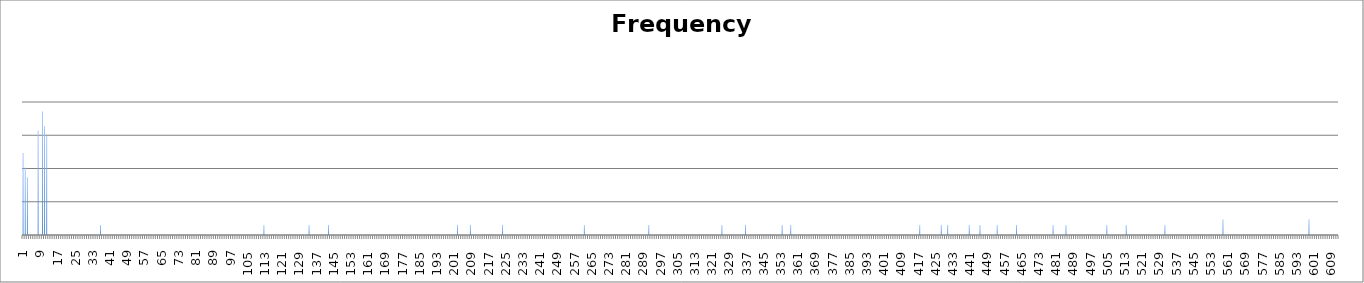
| Category | Series 0 |
|---|---|
| 0 | 282 |
| 1 | 105 |
| 2 | 55 |
| 3 | 0 |
| 4 | 0 |
| 5 | 0 |
| 6 | 0 |
| 7 | 1374 |
| 8 | 0 |
| 9 | 5117 |
| 10 | 1851 |
| 11 | 956 |
| 12 | 0 |
| 13 | 0 |
| 14 | 0 |
| 15 | 0 |
| 16 | 0 |
| 17 | 0 |
| 18 | 0 |
| 19 | 1 |
| 20 | 0 |
| 21 | 0 |
| 22 | 0 |
| 23 | 0 |
| 24 | 0 |
| 25 | 0 |
| 26 | 1 |
| 27 | 1 |
| 28 | 0 |
| 29 | 0 |
| 30 | 0 |
| 31 | 0 |
| 32 | 1 |
| 33 | 0 |
| 34 | 0 |
| 35 | 0 |
| 36 | 2 |
| 37 | 0 |
| 38 | 1 |
| 39 | 0 |
| 40 | 1 |
| 41 | 1 |
| 42 | 0 |
| 43 | 0 |
| 44 | 1 |
| 45 | 1 |
| 46 | 0 |
| 47 | 0 |
| 48 | 0 |
| 49 | 0 |
| 50 | 1 |
| 51 | 0 |
| 52 | 1 |
| 53 | 0 |
| 54 | 0 |
| 55 | 1 |
| 56 | 0 |
| 57 | 0 |
| 58 | 0 |
| 59 | 1 |
| 60 | 0 |
| 61 | 0 |
| 62 | 0 |
| 63 | 1 |
| 64 | 0 |
| 65 | 0 |
| 66 | 0 |
| 67 | 0 |
| 68 | 0 |
| 69 | 0 |
| 70 | 0 |
| 71 | 0 |
| 72 | 0 |
| 73 | 0 |
| 74 | 1 |
| 75 | 0 |
| 76 | 0 |
| 77 | 0 |
| 78 | 0 |
| 79 | 0 |
| 80 | 1 |
| 81 | 0 |
| 82 | 0 |
| 83 | 0 |
| 84 | 1 |
| 85 | 0 |
| 86 | 0 |
| 87 | 0 |
| 88 | 0 |
| 89 | 1 |
| 90 | 0 |
| 91 | 1 |
| 92 | 0 |
| 93 | 1 |
| 94 | 0 |
| 95 | 1 |
| 96 | 0 |
| 97 | 0 |
| 98 | 0 |
| 99 | 1 |
| 100 | 0 |
| 101 | 0 |
| 102 | 0 |
| 103 | 1 |
| 104 | 1 |
| 105 | 1 |
| 106 | 0 |
| 107 | 0 |
| 108 | 1 |
| 109 | 0 |
| 110 | 0 |
| 111 | 0 |
| 112 | 2 |
| 113 | 0 |
| 114 | 0 |
| 115 | 0 |
| 116 | 0 |
| 117 | 1 |
| 118 | 0 |
| 119 | 0 |
| 120 | 0 |
| 121 | 0 |
| 122 | 0 |
| 123 | 0 |
| 124 | 1 |
| 125 | 0 |
| 126 | 0 |
| 127 | 0 |
| 128 | 1 |
| 129 | 0 |
| 130 | 1 |
| 131 | 1 |
| 132 | 0 |
| 133 | 2 |
| 134 | 0 |
| 135 | 0 |
| 136 | 1 |
| 137 | 0 |
| 138 | 1 |
| 139 | 1 |
| 140 | 0 |
| 141 | 0 |
| 142 | 2 |
| 143 | 1 |
| 144 | 1 |
| 145 | 1 |
| 146 | 0 |
| 147 | 1 |
| 148 | 0 |
| 149 | 0 |
| 150 | 0 |
| 151 | 0 |
| 152 | 1 |
| 153 | 0 |
| 154 | 0 |
| 155 | 0 |
| 156 | 0 |
| 157 | 0 |
| 158 | 0 |
| 159 | 0 |
| 160 | 0 |
| 161 | 0 |
| 162 | 0 |
| 163 | 0 |
| 164 | 0 |
| 165 | 0 |
| 166 | 0 |
| 167 | 1 |
| 168 | 0 |
| 169 | 0 |
| 170 | 0 |
| 171 | 0 |
| 172 | 0 |
| 173 | 0 |
| 174 | 0 |
| 175 | 0 |
| 176 | 0 |
| 177 | 0 |
| 178 | 0 |
| 179 | 1 |
| 180 | 0 |
| 181 | 1 |
| 182 | 0 |
| 183 | 0 |
| 184 | 0 |
| 185 | 0 |
| 186 | 1 |
| 187 | 0 |
| 188 | 0 |
| 189 | 0 |
| 190 | 0 |
| 191 | 0 |
| 192 | 0 |
| 193 | 1 |
| 194 | 1 |
| 195 | 0 |
| 196 | 1 |
| 197 | 1 |
| 198 | 0 |
| 199 | 0 |
| 200 | 0 |
| 201 | 0 |
| 202 | 2 |
| 203 | 0 |
| 204 | 0 |
| 205 | 0 |
| 206 | 0 |
| 207 | 0 |
| 208 | 2 |
| 209 | 1 |
| 210 | 1 |
| 211 | 0 |
| 212 | 0 |
| 213 | 0 |
| 214 | 0 |
| 215 | 0 |
| 216 | 0 |
| 217 | 0 |
| 218 | 0 |
| 219 | 1 |
| 220 | 0 |
| 221 | 1 |
| 222 | 0 |
| 223 | 2 |
| 224 | 0 |
| 225 | 0 |
| 226 | 1 |
| 227 | 0 |
| 228 | 0 |
| 229 | 0 |
| 230 | 0 |
| 231 | 0 |
| 232 | 0 |
| 233 | 1 |
| 234 | 0 |
| 235 | 0 |
| 236 | 0 |
| 237 | 0 |
| 238 | 1 |
| 239 | 0 |
| 240 | 0 |
| 241 | 0 |
| 242 | 0 |
| 243 | 0 |
| 244 | 0 |
| 245 | 0 |
| 246 | 0 |
| 247 | 1 |
| 248 | 0 |
| 249 | 0 |
| 250 | 0 |
| 251 | 1 |
| 252 | 1 |
| 253 | 0 |
| 254 | 1 |
| 255 | 1 |
| 256 | 1 |
| 257 | 0 |
| 258 | 1 |
| 259 | 0 |
| 260 | 0 |
| 261 | 2 |
| 262 | 0 |
| 263 | 1 |
| 264 | 0 |
| 265 | 1 |
| 266 | 1 |
| 267 | 0 |
| 268 | 0 |
| 269 | 0 |
| 270 | 0 |
| 271 | 1 |
| 272 | 1 |
| 273 | 1 |
| 274 | 1 |
| 275 | 0 |
| 276 | 0 |
| 277 | 0 |
| 278 | 0 |
| 279 | 0 |
| 280 | 0 |
| 281 | 0 |
| 282 | 1 |
| 283 | 0 |
| 284 | 0 |
| 285 | 1 |
| 286 | 0 |
| 287 | 0 |
| 288 | 0 |
| 289 | 0 |
| 290 | 0 |
| 291 | 2 |
| 292 | 1 |
| 293 | 0 |
| 294 | 0 |
| 295 | 0 |
| 296 | 1 |
| 297 | 0 |
| 298 | 1 |
| 299 | 1 |
| 300 | 1 |
| 301 | 0 |
| 302 | 0 |
| 303 | 0 |
| 304 | 0 |
| 305 | 0 |
| 306 | 0 |
| 307 | 1 |
| 308 | 0 |
| 309 | 1 |
| 310 | 0 |
| 311 | 0 |
| 312 | 1 |
| 313 | 0 |
| 314 | 0 |
| 315 | 0 |
| 316 | 0 |
| 317 | 0 |
| 318 | 1 |
| 319 | 1 |
| 320 | 0 |
| 321 | 0 |
| 322 | 0 |
| 323 | 0 |
| 324 | 0 |
| 325 | 2 |
| 326 | 0 |
| 327 | 0 |
| 328 | 0 |
| 329 | 0 |
| 330 | 0 |
| 331 | 1 |
| 332 | 0 |
| 333 | 1 |
| 334 | 1 |
| 335 | 0 |
| 336 | 2 |
| 337 | 0 |
| 338 | 1 |
| 339 | 0 |
| 340 | 0 |
| 341 | 0 |
| 342 | 0 |
| 343 | 0 |
| 344 | 0 |
| 345 | 0 |
| 346 | 1 |
| 347 | 0 |
| 348 | 0 |
| 349 | 0 |
| 350 | 1 |
| 351 | 0 |
| 352 | 1 |
| 353 | 2 |
| 354 | 0 |
| 355 | 0 |
| 356 | 0 |
| 357 | 2 |
| 358 | 0 |
| 359 | 0 |
| 360 | 0 |
| 361 | 0 |
| 362 | 0 |
| 363 | 0 |
| 364 | 0 |
| 365 | 0 |
| 366 | 1 |
| 367 | 0 |
| 368 | 0 |
| 369 | 0 |
| 370 | 0 |
| 371 | 1 |
| 372 | 0 |
| 373 | 0 |
| 374 | 0 |
| 375 | 0 |
| 376 | 0 |
| 377 | 0 |
| 378 | 0 |
| 379 | 0 |
| 380 | 0 |
| 381 | 0 |
| 382 | 1 |
| 383 | 0 |
| 384 | 0 |
| 385 | 0 |
| 386 | 1 |
| 387 | 0 |
| 388 | 1 |
| 389 | 0 |
| 390 | 0 |
| 391 | 0 |
| 392 | 0 |
| 393 | 0 |
| 394 | 0 |
| 395 | 0 |
| 396 | 0 |
| 397 | 0 |
| 398 | 0 |
| 399 | 0 |
| 400 | 1 |
| 401 | 0 |
| 402 | 0 |
| 403 | 1 |
| 404 | 0 |
| 405 | 0 |
| 406 | 0 |
| 407 | 0 |
| 408 | 0 |
| 409 | 0 |
| 410 | 0 |
| 411 | 0 |
| 412 | 0 |
| 413 | 0 |
| 414 | 1 |
| 415 | 1 |
| 416 | 0 |
| 417 | 2 |
| 418 | 0 |
| 419 | 1 |
| 420 | 0 |
| 421 | 0 |
| 422 | 1 |
| 423 | 0 |
| 424 | 0 |
| 425 | 1 |
| 426 | 0 |
| 427 | 2 |
| 428 | 0 |
| 429 | 1 |
| 430 | 2 |
| 431 | 0 |
| 432 | 0 |
| 433 | 1 |
| 434 | 0 |
| 435 | 0 |
| 436 | 0 |
| 437 | 0 |
| 438 | 0 |
| 439 | 0 |
| 440 | 2 |
| 441 | 1 |
| 442 | 0 |
| 443 | 0 |
| 444 | 0 |
| 445 | 2 |
| 446 | 0 |
| 447 | 0 |
| 448 | 0 |
| 449 | 0 |
| 450 | 0 |
| 451 | 0 |
| 452 | 0 |
| 453 | 2 |
| 454 | 0 |
| 455 | 1 |
| 456 | 0 |
| 457 | 0 |
| 458 | 0 |
| 459 | 1 |
| 460 | 0 |
| 461 | 0 |
| 462 | 2 |
| 463 | 0 |
| 464 | 0 |
| 465 | 1 |
| 466 | 0 |
| 467 | 0 |
| 468 | 0 |
| 469 | 0 |
| 470 | 0 |
| 471 | 0 |
| 472 | 0 |
| 473 | 0 |
| 474 | 0 |
| 475 | 0 |
| 476 | 1 |
| 477 | 0 |
| 478 | 0 |
| 479 | 2 |
| 480 | 0 |
| 481 | 0 |
| 482 | 1 |
| 483 | 0 |
| 484 | 0 |
| 485 | 2 |
| 486 | 0 |
| 487 | 0 |
| 488 | 1 |
| 489 | 1 |
| 490 | 0 |
| 491 | 1 |
| 492 | 1 |
| 493 | 0 |
| 494 | 0 |
| 495 | 0 |
| 496 | 0 |
| 497 | 1 |
| 498 | 0 |
| 499 | 0 |
| 500 | 0 |
| 501 | 1 |
| 502 | 1 |
| 503 | 0 |
| 504 | 2 |
| 505 | 0 |
| 506 | 1 |
| 507 | 1 |
| 508 | 0 |
| 509 | 1 |
| 510 | 0 |
| 511 | 0 |
| 512 | 0 |
| 513 | 2 |
| 514 | 0 |
| 515 | 0 |
| 516 | 0 |
| 517 | 1 |
| 518 | 1 |
| 519 | 0 |
| 520 | 0 |
| 521 | 0 |
| 522 | 1 |
| 523 | 1 |
| 524 | 0 |
| 525 | 0 |
| 526 | 0 |
| 527 | 0 |
| 528 | 0 |
| 529 | 0 |
| 530 | 0 |
| 531 | 2 |
| 532 | 0 |
| 533 | 0 |
| 534 | 0 |
| 535 | 0 |
| 536 | 0 |
| 537 | 0 |
| 538 | 0 |
| 539 | 1 |
| 540 | 0 |
| 541 | 0 |
| 542 | 1 |
| 543 | 0 |
| 544 | 0 |
| 545 | 0 |
| 546 | 0 |
| 547 | 1 |
| 548 | 0 |
| 549 | 0 |
| 550 | 1 |
| 551 | 0 |
| 552 | 0 |
| 553 | 0 |
| 554 | 0 |
| 555 | 1 |
| 556 | 0 |
| 557 | 1 |
| 558 | 3 |
| 559 | 0 |
| 560 | 0 |
| 561 | 0 |
| 562 | 0 |
| 563 | 0 |
| 564 | 0 |
| 565 | 0 |
| 566 | 0 |
| 567 | 0 |
| 568 | 0 |
| 569 | 1 |
| 570 | 1 |
| 571 | 0 |
| 572 | 0 |
| 573 | 0 |
| 574 | 0 |
| 575 | 0 |
| 576 | 0 |
| 577 | 0 |
| 578 | 0 |
| 579 | 0 |
| 580 | 0 |
| 581 | 0 |
| 582 | 0 |
| 583 | 1 |
| 584 | 0 |
| 585 | 0 |
| 586 | 0 |
| 587 | 0 |
| 588 | 0 |
| 589 | 0 |
| 590 | 0 |
| 591 | 0 |
| 592 | 1 |
| 593 | 1 |
| 594 | 0 |
| 595 | 0 |
| 596 | 0 |
| 597 | 0 |
| 598 | 3 |
| 599 | 0 |
| 600 | 0 |
| 601 | 0 |
| 602 | 0 |
| 603 | 0 |
| 604 | 1 |
| 605 | 0 |
| 606 | 0 |
| 607 | 0 |
| 608 | 0 |
| 609 | 0 |
| 610 | 0 |
| 611 | 0 |